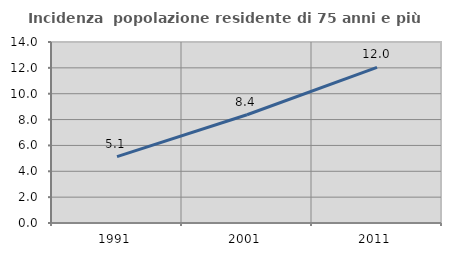
| Category | Incidenza  popolazione residente di 75 anni e più |
|---|---|
| 1991.0 | 5.132 |
| 2001.0 | 8.376 |
| 2011.0 | 12.043 |